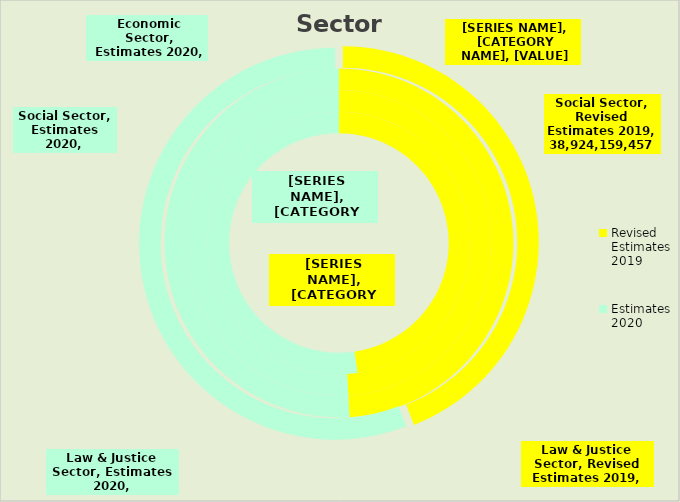
| Category | Administrative Sector | Economic Sector | Law & Justice Sector | Social Sector |
|---|---|---|---|---|
| Revised Estimates 2019 | 51411563127 | 60506997636 | 7329340751 | 38924159457 |
| Estimates 2020 | 56234799399.2 | 62907264259 | 7615226584 | 49365801689.298 |